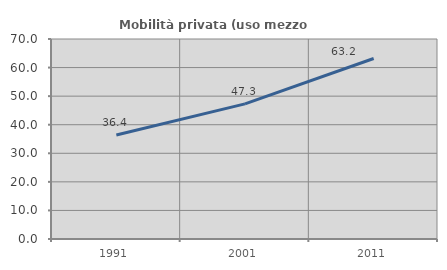
| Category | Mobilità privata (uso mezzo privato) |
|---|---|
| 1991.0 | 36.388 |
| 2001.0 | 47.285 |
| 2011.0 | 63.182 |